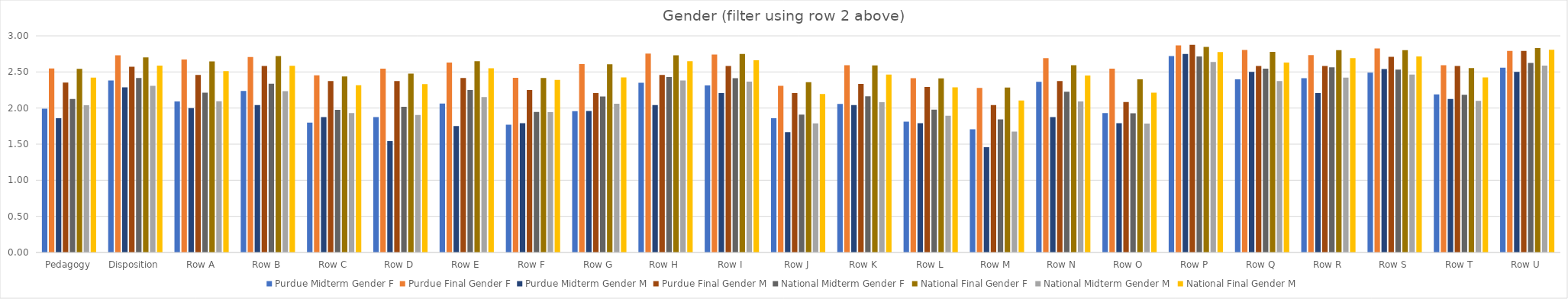
| Category | Purdue | National |
|---|---|---|
| Pedagogy | 2.353 | 2.421 |
| Disposition | 2.573 | 2.588 |
| Row A | 2.458 | 2.512 |
| Row B | 2.583 | 2.584 |
| Row C | 2.375 | 2.316 |
| Row D | 2.375 | 2.333 |
| Row E | 2.417 | 2.552 |
| Row F | 2.25 | 2.39 |
| Row G | 2.208 | 2.424 |
| Row H | 2.458 | 2.65 |
| Row I | 2.583 | 2.662 |
| Row J | 2.208 | 2.195 |
| Row K | 2.333 | 2.464 |
| Row L | 2.292 | 2.287 |
| Row M | 2.042 | 2.104 |
| Row N | 2.375 | 2.45 |
| Row O | 2.083 | 2.214 |
| Row P | 2.875 | 2.776 |
| Row Q | 2.583 | 2.631 |
| Row R | 2.583 | 2.69 |
| Row S | 2.708 | 2.714 |
| Row T | 2.583 | 2.425 |
| Row U | 2.792 | 2.806 |